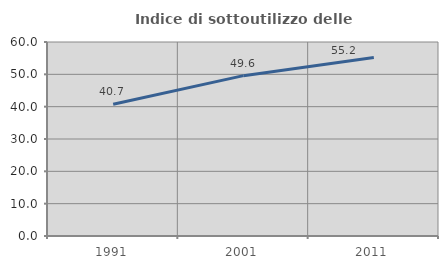
| Category | Indice di sottoutilizzo delle abitazioni  |
|---|---|
| 1991.0 | 40.726 |
| 2001.0 | 49.59 |
| 2011.0 | 55.172 |